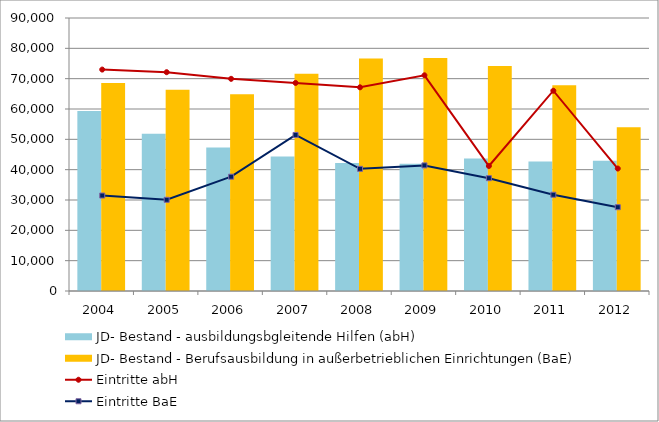
| Category | JD- Bestand - ausbildungsbgleitende Hilfen (abH) | JD- Bestand - Berufsausbildung in außerbetrieblichen Einrichtungen (BaE) |
|---|---|---|
| 2004.0 | 59363 | 68581 |
| 2005.0 | 51878 | 66385 |
| 2006.0 | 47301 | 64873 |
| 2007.0 | 44323 | 71650 |
| 2008.0 | 42232 | 76689 |
| 2009.0 | 41936 | 76831 |
| 2010.0 | 43722 | 74170 |
| 2011.0 | 42712 | 67789 |
| 2012.0 | 42935 | 54013 |